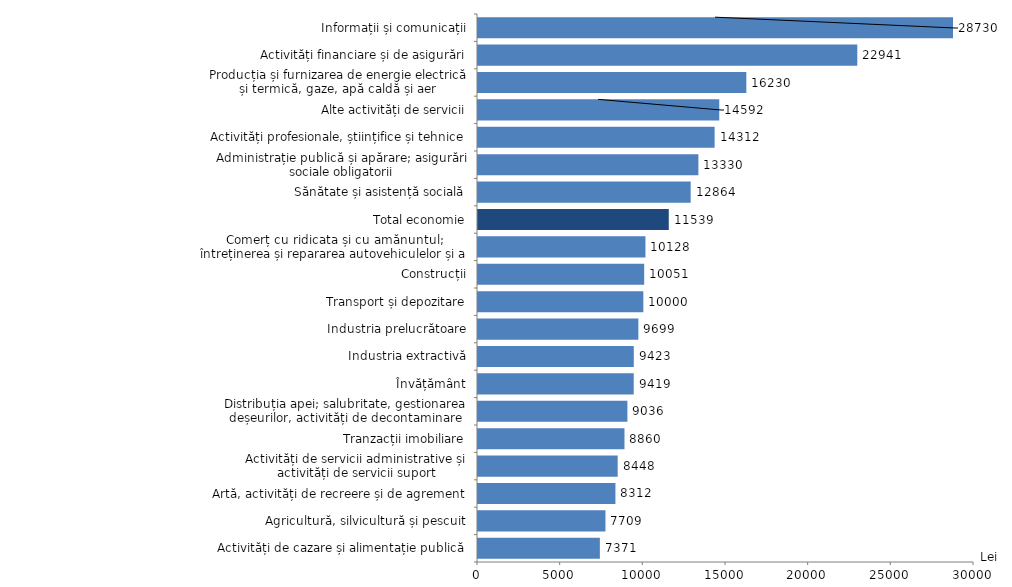
| Category | Lei |
|---|---|
| Activități de cazare și alimentație publică | 7370.7 |
| Agricultură, silvicultură și pescuit | 7709.4 |
| Artă, activități de recreere și de agrement | 8312.4 |
| Activități de servicii administrative și activități de servicii suport | 8448.2 |
| Tranzacții imobiliare | 8859.6 |
| Distribuția apei; salubritate, gestionarea deșeurilor, activități de decontaminare | 9036.2 |
| Învățământ | 9418.7 |
| Industria extractivă | 9422.7 |
| Industria prelucrătoare | 9698.7 |
| Transport și depozitare | 9999.7 |
| Construcții | 10051.4 |
| Comerț cu ridicata și cu amănuntul; întreținerea și repararea autovehiculelor și a motocicletelor | 10128.3 |
| Total economie | 11539.1 |
| Sănătate și asistență socială | 12863.8 |
| Administrație publică și apărare; asigurări sociale obligatorii | 13330.1 |
| Activități profesionale, științifice și tehnice | 14311.8 |
| Alte activități de servicii | 14591.5 |
| Producția și furnizarea de energie electrică și termică, gaze, apă caldă și aer condiționat | 16230 |
| Activități financiare și de asigurări | 22940.9 |
| Informații și comunicații | 28730.4 |